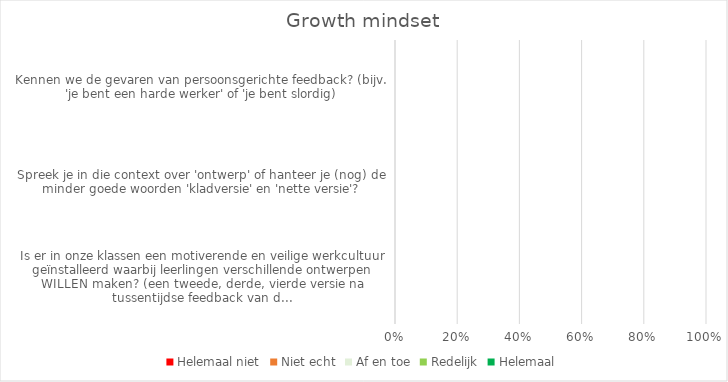
| Category | Helemaal niet | Niet echt | Af en toe | Redelijk | Helemaal |
|---|---|---|---|---|---|
| Is er in onze klassen een motiverende en veilige werkcultuur geïnstalleerd waarbij leerlingen verschillende ontwerpen WILLEN maken? (een tweede, derde, vierde versie na tussentijdse feedback van d... | 0 | 0 | 0 | 0 | 0 |
| Spreek je in die context over 'ontwerp' of hanteer je (nog) de minder goede woorden 'kladversie' en 'nette versie'? | 0 | 0 | 0 | 0 | 0 |
| Kennen we de gevaren van persoonsgerichte feedback? (bijv. 'je bent een harde werker' of 'je bent slordig) | 0 | 0 | 0 | 0 | 0 |